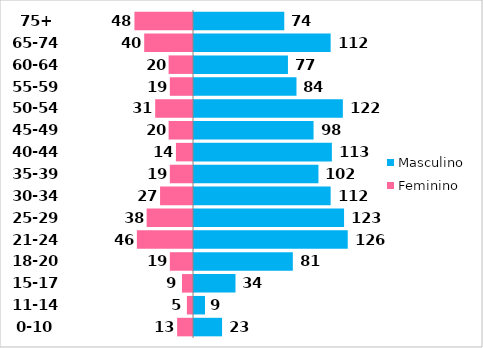
| Category | Feminino | Masculino |
|---|---|---|
| 0-10 | -13 | 23 |
| 11-14 | -5 | 9 |
| 15-17 | -9 | 34 |
| 18-20 | -19 | 81 |
| 21-24 | -46 | 126 |
| 25-29 | -38 | 123 |
| 30-34 | -27 | 112 |
| 35-39 | -19 | 102 |
| 40-44 | -14 | 113 |
| 45-49 | -20 | 98 |
| 50-54 | -31 | 122 |
| 55-59 | -19 | 84 |
| 60-64 | -20 | 77 |
| 65-74 | -40 | 112 |
| 75+ | -48 | 74 |